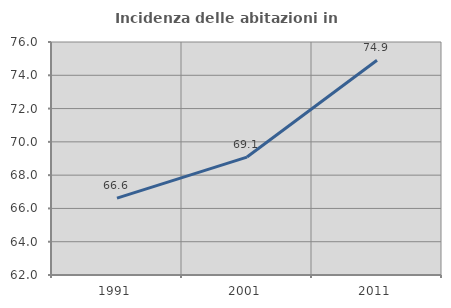
| Category | Incidenza delle abitazioni in proprietà  |
|---|---|
| 1991.0 | 66.621 |
| 2001.0 | 69.087 |
| 2011.0 | 74.904 |